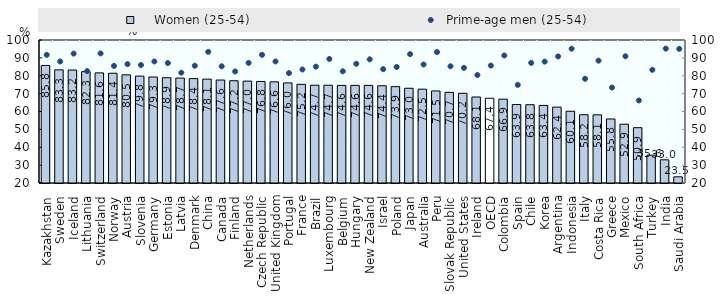
| Category |     Women (25-54) |
|---|---|
| Kazakhstan  | 85.765 |
| Sweden  | 83.3 |
| Iceland  | 83.2 |
| Lithuania  | 82.3 |
| Switzerland  | 81.6 |
| Norway  | 81.4 |
| Austria  | 80.5 |
| Slovenia  | 79.8 |
| Germany  | 79.3 |
| Estonia  | 78.9 |
| Latvia  | 78.7 |
| Denmark  | 78.4 |
| China  | 78.112 |
| Canada  | 77.6 |
| Finland  | 77.2 |
| Netherlands  | 77 |
| Czech Republic  | 76.8 |
| United Kingdom  | 76.6 |
| Portugal  | 76 |
| France  | 75.2 |
| Brazil  | 74.702 |
| Luxembourg  | 74.7 |
| Belgium  | 74.6 |
| Hungary  | 74.6 |
| New Zealand  | 74.6 |
| Israel  | 74.4 |
| Poland  | 73.9 |
| Japan  | 73 |
| Australia  | 72.5 |
| Peru  | 71.495 |
| Slovak Republic  | 70.7 |
| United States  | 70.2 |
| Ireland  | 68.1 |
| OECD  | 67.4 |
| Colombia  | 66.9 |
| Spain  | 63.9 |
| Chile  | 63.8 |
| Korea  | 63.4 |
| Argentina  | 62.45 |
| Indonesia  | 60.143 |
| Italy  | 58.2 |
| Costa Rica  | 58.124 |
| Greece  | 55.8 |
| Mexico  | 52.9 |
| South Africa  | 50.948 |
| Turkey  | 35.6 |
| India  | 32.978 |
| Saudi Arabia  | 23.457 |